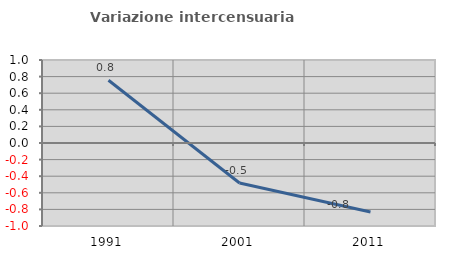
| Category | Variazione intercensuaria annua |
|---|---|
| 1991.0 | 0.756 |
| 2001.0 | -0.481 |
| 2011.0 | -0.831 |